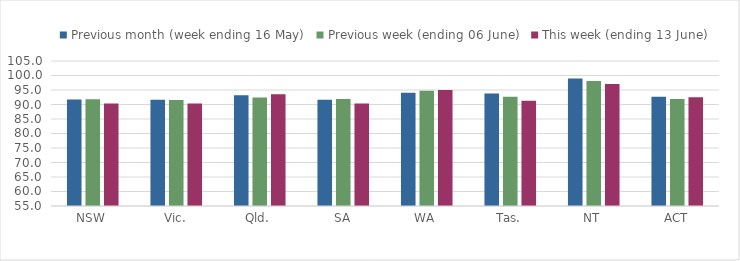
| Category | Previous month (week ending 16 May) | Previous week (ending 06 June) | This week (ending 13 June) |
|---|---|---|---|
| NSW | 91.76 | 91.801 | 90.369 |
| Vic. | 91.631 | 91.565 | 90.307 |
| Qld. | 93.178 | 92.457 | 93.561 |
| SA | 91.667 | 91.878 | 90.373 |
| WA | 94.029 | 94.705 | 94.978 |
| Tas. | 93.833 | 92.676 | 91.328 |
| NT | 98.99 | 98.092 | 97.077 |
| ACT | 92.662 | 91.923 | 92.485 |